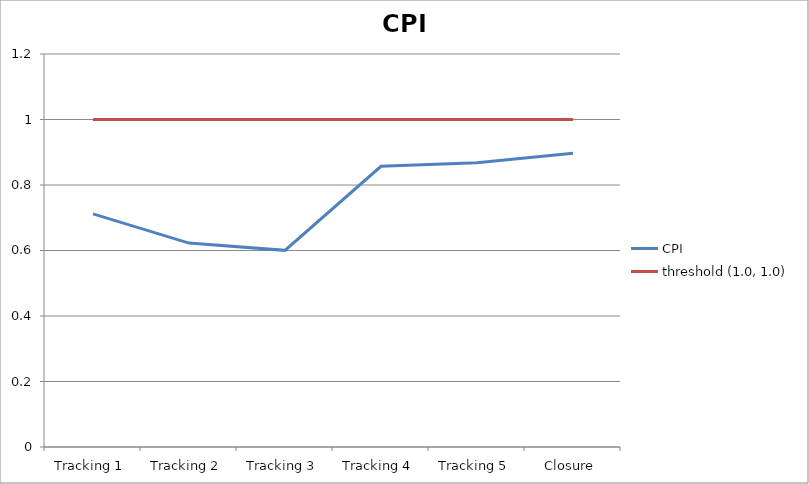
| Category | CPI | threshold (1.0, 1.0) |
|---|---|---|
| Tracking 1 | 0.712 | 1 |
| Tracking 2 | 0.623 | 1 |
| Tracking 3 | 0.6 | 1 |
| Tracking 4 | 0.857 | 1 |
| Tracking 5 | 0.868 | 1 |
| Closure | 0.897 | 1 |